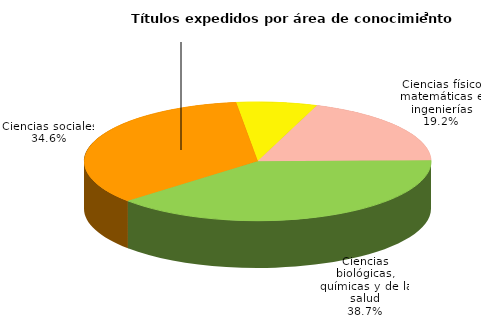
| Category | Series 0 |
|---|---|
| Ciencias físico matemáticas e ingenierías | 4456 |
| Ciencias biológicas, químicas y de la salud | 8990 |
| Ciencias sociales | 8037 |
| Humanidades y artes | 1755 |